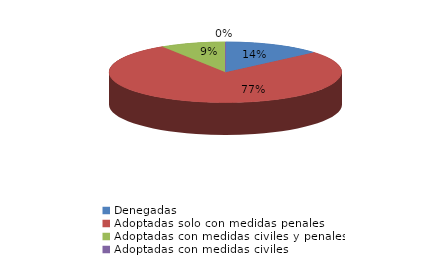
| Category | Series 0 |
|---|---|
| Denegadas | 15 |
| Adoptadas solo con medidas penales | 85 |
| Adoptadas con medidas civiles y penales | 10 |
| Adoptadas con medidas civiles | 0 |